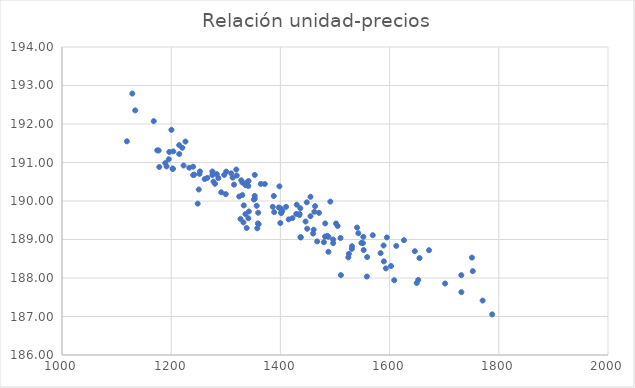
| Category | Series 0 |
|---|---|
| 1437.15613009138 | 189.053 |
| 1448.29381582565 | 189.965 |
| 1357.65481558062 | 189.29 |
| 1436.45423094942 | 189.813 |
| 1297.09945064773 | 190.677 |
| 1467.41793830396 | 188.95 |
| 1463.46393251398 | 189.866 |
| 1652.50132508073 | 187.95 |
| 1410.41698452198 | 189.848 |
| 1654.80730553234 | 188.517 |
| 1548.34600233053 | 188.913 |
| 1496.64102097187 | 188.907 |
| 1594.98326142665 | 189.054 |
| 1479.66231493652 | 188.929 |
| 1324.5662535555 | 190.117 |
| 1266.08323449435 | 190.6 |
| 1300.79909441085 | 190.764 |
| 1128.83588420296 | 192.79 |
| 1203.03445454917 | 190.831 |
| 1462.16450255191 | 189.721 |
| 1196.44855688993 | 191.273 |
| 1319.2226589551601 | 190.817 |
| 1233.10079468023 | 190.865 |
| 1250.48330164264 | 190.299 |
| 1177.07751667834 | 191.312 |
| 1558.92435727416 | 188.544 |
| 1220.30964818289 | 191.383 |
| 1341.31145773083 | 189.551 |
| 1242.27096674104 | 190.685 |
| 1551.10269804084 | 188.908 |
| 1214.64846932937 | 191.221 |
| 1485.86956304318 | 189.094 |
| 1358.75738925649 | 189.418 |
| 1309.99145616143 | 190.717 |
| 1626.27209068335 | 188.982 |
| 1770.41398472204 | 187.414 |
| 1342.17150045546 | 189.728 |
| 1387.90542500311 | 190.13 |
| 1388.60736445583 | 189.711 |
| 1460.89859382735 | 189.255 |
| 1415.17212604101 | 189.523 |
| 1487.97410432479 | 189.07 |
| 1583.54935284133 | 188.646 |
| 1731.43553859639 | 187.632 |
| 1214.58717508138 | 191.451 |
| 1455.08860990734 | 189.605 |
| 1168.03546700614 | 192.074 |
| 1280.25885756586 | 190.446 |
| 1200.43829079024 | 191.849 |
| 1501.94568242667 | 189.416 |
| 1261.34684324497 | 190.57 |
| 1422.08735501176 | 189.555 |
| 1455.09335746265 | 190.109 |
| 1470.69021770915 | 189.693 |
| 1341.65248202826 | 190.519 |
| 1276.81687549978 | 190.7 |
| 1787.87278904095 | 187.054 |
| 1195.51645024641 | 191.084 |
| 1672.13927424862 | 188.722 |
| 1286.35964931007 | 190.595 |
| 1189.17495036554 | 190.986 |
| 1356.61061521007 | 189.876 |
| 1608.48883621603 | 187.943 |
| 1240.10663713124 | 190.891 |
| 1542.73056258142 | 189.163 |
| 1178.18639079515 | 190.884 |
| 1429.00891532848 | 189.665 |
| 1299.93766727416 | 190.179 |
| 1332.31489299311 | 189.444 |
| 1481.80099391362 | 189.076 |
| 1482.09484618945 | 189.417 |
| 1291.66669229162 | 190.226 |
| 1277.43551018193 | 190.504 |
| 1435.05517273492 | 189.662 |
| 1396.98039846227 | 189.832 |
| 1203.80003735701 | 191.288 |
| 1337.6492833185 | 190.476 |
| 1701.65056317649 | 187.857 |
| 1552.54475880201 | 188.726 |
| 1328.33239224677 | 190.537 |
| 1353.05754655997 | 190.06 |
| 1371.39725574017 | 190.442 |
| 1174.44149086781 | 191.316 |
| 1202.73120999119 | 190.845 |
| 1496.46521215768 | 188.998 |
| 1326.93235877734 | 189.535 |
| 1222.63028516751 | 190.922 |
| 1524.42160345169 | 188.536 |
| 1504.79734103386 | 189.351 |
| 1459.92366620381 | 189.154 |
| 1446.08339976843 | 189.467 |
| 1649.68242031499 | 187.871 |
| 1491.44930536666 | 189.984 |
| 1240.17678993743 | 190.673 |
| 1449.09381867413 | 189.28 |
| 1525.44905470089 | 188.626 |
| 1351.37828091461 | 190.039 |
| 1359.30108208148 | 189.695 |
| 1569.20365106954 | 189.111 |
| 1551.8013938942 | 189.068 |
| 1398.20780799686 | 190.38 |
| 1330.23043278641 | 190.153 |
| 1252.61360974547 | 190.768 |
| 1530.81194651855 | 188.756 |
| 1226.13007831192 | 191.544 |
| 1752.31003457813 | 188.178 |
| 1750.76719655736 | 188.529 |
| 1251.79364755707 | 190.705 |
| 1510.86076772732 | 188.075 |
| 1134.07189060644 | 192.354 |
| 1401.45128997548 | 189.686 |
| 1275.31510947875 | 190.677 |
| 1399.86137774902 | 189.428 |
| 1540.43623234529 | 189.312 |
| 1531.12510266609 | 188.825 |
| 1437.08689120658 | 189.061 |
| 1588.92659061749 | 188.845 |
| 1341.26002335038 | 190.39 |
| 1312.47093454314 | 190.608 |
| 1335.94652823712 | 189.66 |
| 1360.17606392828 | 189.398 |
| 1731.35182349672 | 188.074 |
| 1191.51807085176 | 190.898 |
| 1336.32270091113 | 190.409 |
| 1612.18969876465 | 188.833 |
| 1429.89525923673 | 189.904 |
| 1400.19950014578 | 189.81 |
| 1386.00581651095 | 189.849 |
| 1330.61740728508 | 190.477 |
| 1403.58155600411 | 189.741 |
| 1589.44639933221 | 188.433 |
| 1558.35985823017 | 188.038 |
| 1315.05425325401 | 190.424 |
| 1275.40070122856 | 190.766 |
| 1364.21475348035 | 190.443 |
| 1283.48625766514 | 190.699 |
| 1487.91300673685 | 188.68 |
| 1332.88525092152 | 189.885 |
| 1401.55688299794 | 189.706 |
| 1248.50419036792 | 189.932 |
| 1434.81770278351 | 189.635 |
| 1352.97466841736 | 190.133 |
| 1510.0925727944 | 189.038 |
| 1602.59780973698 | 188.311 |
| 1118.81868008242 | 191.55 |
| 1338.27944094046 | 189.299 |
| 1646.18867237211 | 188.696 |
| 1320.12445476084 | 190.66 |
| 1593.10413685577 | 188.25 |
| 1353.05754655997 | 190.677 |